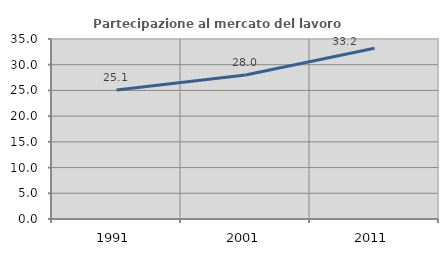
| Category | Partecipazione al mercato del lavoro  femminile |
|---|---|
| 1991.0 | 25.102 |
| 2001.0 | 27.99 |
| 2011.0 | 33.208 |